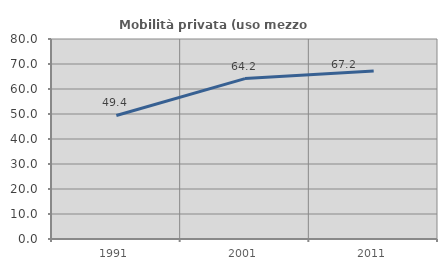
| Category | Mobilità privata (uso mezzo privato) |
|---|---|
| 1991.0 | 49.406 |
| 2001.0 | 64.167 |
| 2011.0 | 67.194 |